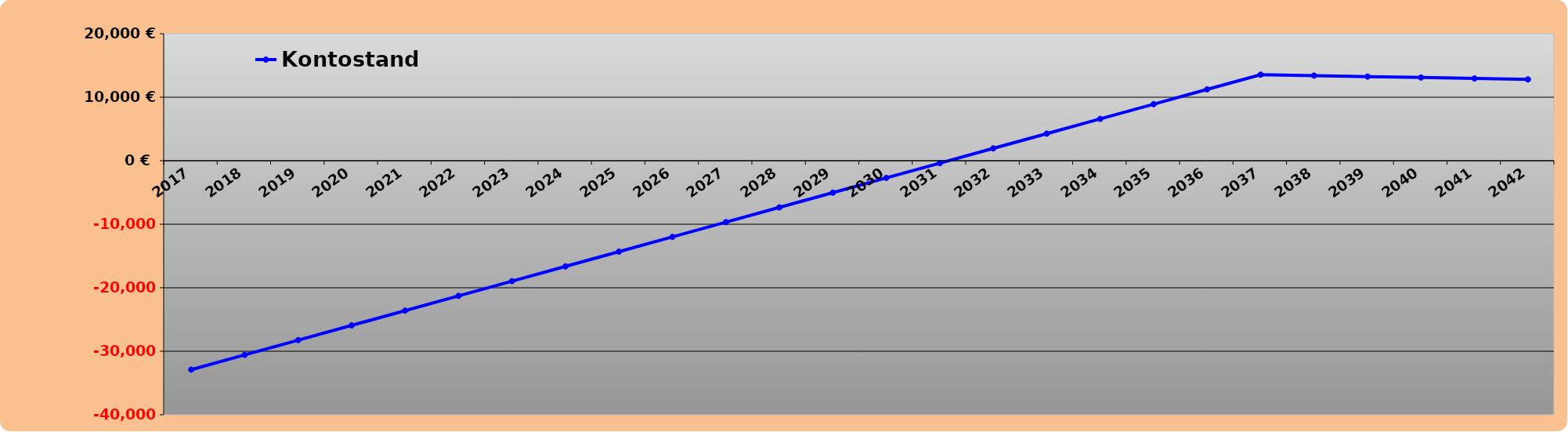
| Category | Kontostand |
|---|---|
| 2017.0 | -32895.539 |
| 2018.0 | -30573.077 |
| 2019.0 | -28250.616 |
| 2020.0 | -25928.155 |
| 2021.0 | -23605.694 |
| 2022.0 | -21283.232 |
| 2023.0 | -18960.771 |
| 2024.0 | -16638.31 |
| 2025.0 | -14315.849 |
| 2026.0 | -11993.387 |
| 2027.0 | -9670.926 |
| 2028.0 | -7348.465 |
| 2029.0 | -5026.004 |
| 2030.0 | -2703.542 |
| 2031.0 | -381.081 |
| 2032.0 | 1941.38 |
| 2033.0 | 4263.841 |
| 2034.0 | 6586.303 |
| 2035.0 | 8908.764 |
| 2036.0 | 11231.225 |
| 2037.0 | 13553.686 |
| 2038.0 | 13403.956 |
| 2039.0 | 13254.226 |
| 2040.0 | 13104.496 |
| 2041.0 | 12954.766 |
| 2042.0 | 12805.036 |